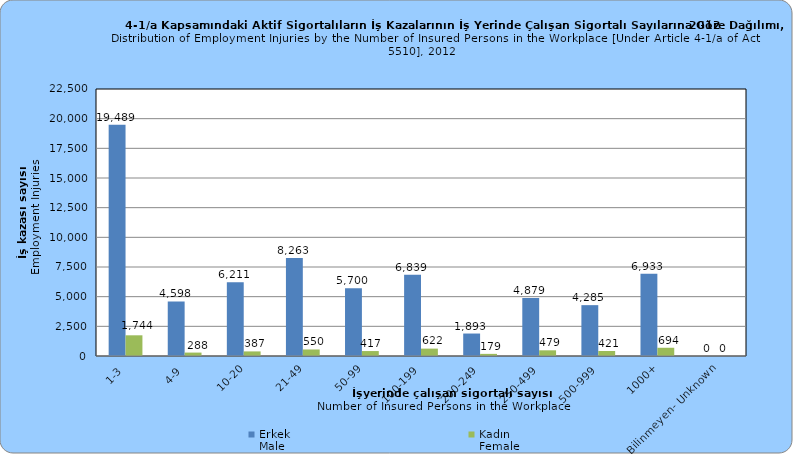
| Category | Erkek
Male | Kadın
Female |
|---|---|---|
| 1-3 | 19489 | 1744 |
| 4-9 | 4598 | 288 |
| 10-20 | 6211 | 387 |
| 21-49 | 8263 | 550 |
| 50-99 | 5700 | 417 |
| 100-199 | 6839 | 622 |
| 200-249 | 1893 | 179 |
| 250-499 | 4879 | 479 |
| 500-999 | 4285 | 421 |
| 1000+ | 6933 | 694 |
| Bilinmeyen- Unknown | 0 | 0 |